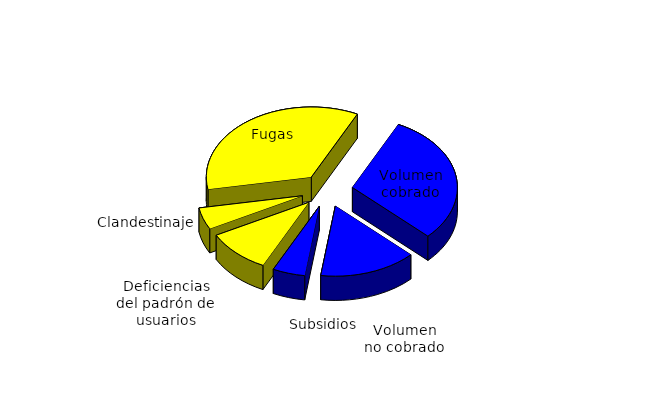
| Category | Series 0 |
|---|---|
| 0 | 35 |
| 1 | 30 |
| 2 | 15 |
| 3 | 5 |
| 4 | 10 |
| 5 | 5 |